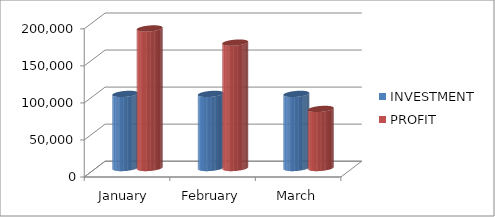
| Category | INVESTMENT | PROFIT |
|---|---|---|
| January  | 100000 | 188320 |
| February | 100000 | 169220 |
| March | 100000 | 79725 |